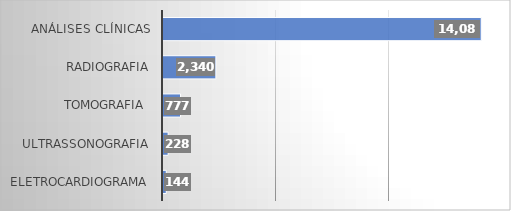
| Category | Series 0 |
|---|---|
| ELETROCARDIOGRAMA | 144 |
| ULTRASSONOGRAFIA | 228 |
| TOMOGRAFIA  | 777 |
| RADIOGRAFIA | 2340 |
| ANÁLISES CLÍNICAS | 14082 |